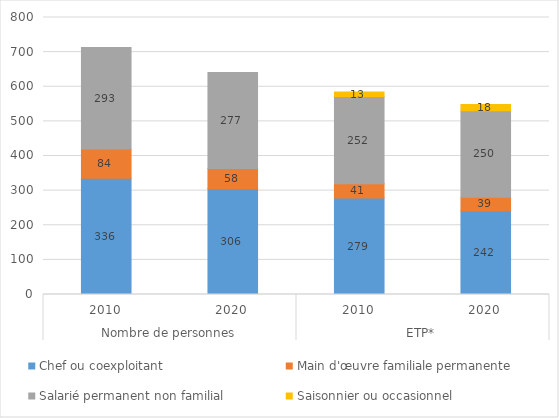
| Category | Chef ou coexploitant | Main d'œuvre familiale permanente | Salarié permanent non familial | Saisonnier ou occasionnel |
|---|---|---|---|---|
| 0 | 336 | 84 | 293 | 0 |
| 1 | 306 | 58 | 277 | 0 |
| 2 | 279 | 41 | 252 | 13 |
| 3 | 242 | 39 | 250 | 18 |